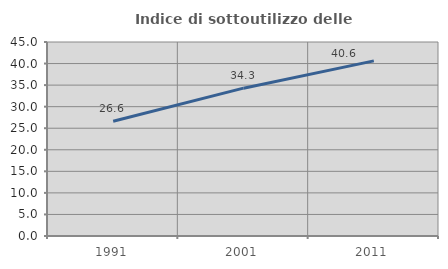
| Category | Indice di sottoutilizzo delle abitazioni  |
|---|---|
| 1991.0 | 26.6 |
| 2001.0 | 34.291 |
| 2011.0 | 40.615 |